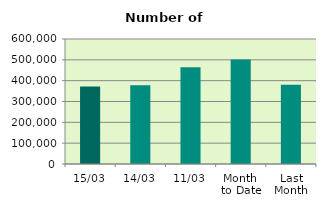
| Category | Series 0 |
|---|---|
| 15/03 | 372368 |
| 14/03 | 378052 |
| 11/03 | 464832 |
| Month 
to Date | 501444.182 |
| Last
Month | 380345.4 |